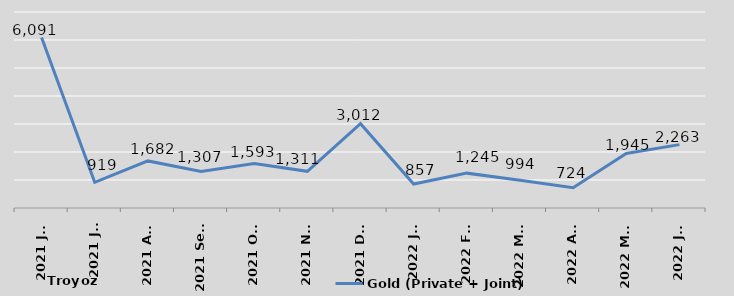
| Category | Gold (Private + Joint) |
|---|---|
| 2021 Jun | 6091 |
| 2021 Jul | 919 |
| 2021 Aug | 1682 |
| 2021 Sept | 1307 |
| 2021 Oct | 1593 |
| 2021 Nov | 1311 |
| 2021 Dec | 3012 |
| 2022 Jan | 857 |
| 2022 Feb | 1245 |
| 2022 Mar | 994 |
| 2022 Apr | 724 |
| 2022 May | 1945 |
| 2022 Jun | 2263 |